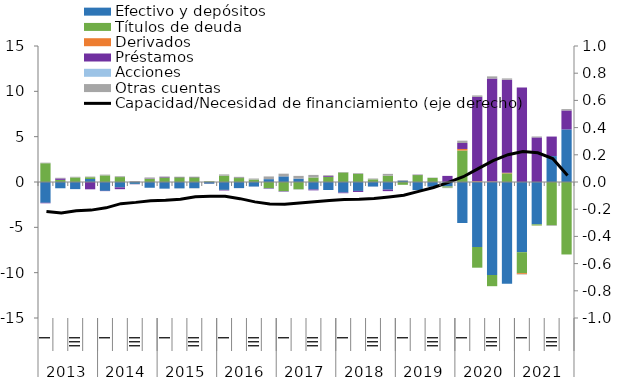
| Category | Efectivo y depósitos | Títulos de deuda | Derivados | Préstamos  | Acciones  | Otras cuentas |
|---|---|---|---|---|---|---|
| 0 | -2.293 | 2.069 | 0 | -0.055 | -0.001 | 0.063 |
| 1 | -0.692 | 0.233 | 0 | 0.161 | 0 | 0.069 |
| 2 | -0.786 | 0.501 | 0 | 0 | -0.001 | 0.075 |
| 3 | 0.331 | 0.197 | 0 | -0.806 | -0.001 | 0.072 |
| 4 | -0.977 | 0.727 | 0 | -0.028 | 0 | 0.088 |
| 5 | -0.594 | 0.545 | 0 | -0.199 | 0 | 0.09 |
| 6 | -0.211 | -0.016 | 0 | -0.024 | -0.001 | 0.102 |
| 7 | -0.636 | 0.349 | 0 | 0.048 | -0.004 | 0.104 |
| 8 | -0.735 | 0.5 | 0 | 0.069 | -0.006 | 0.036 |
| 9 | -0.704 | 0.518 | -0.004 | 0.029 | -0.004 | 0.037 |
| 10 | -0.689 | 0.516 | -0.006 | 0.03 | -0.003 | 0.043 |
| 11 | -0.191 | 0.076 | -0.005 | -0.009 | 0 | 0.026 |
| 12 | -0.871 | 0.694 | -0.008 | -0.055 | -0.008 | 0.142 |
| 13 | -0.666 | 0.438 | -0.003 | -0.005 | -0.016 | 0.131 |
| 14 | -0.503 | 0.268 | 0.002 | -0.009 | -0.017 | 0.112 |
| 15 | 0.316 | -0.702 | 0.002 | -0.05 | -0.024 | 0.296 |
| 16 | 0.622 | -1.017 | 0.007 | -0.05 | -0.015 | 0.288 |
| 17 | 0.375 | -0.811 | 0.005 | -0.008 | -0.008 | 0.293 |
| 18 | -0.829 | 0.496 | 0.002 | -0.091 | -0.006 | 0.283 |
| 19 | -0.884 | 0.575 | 0.001 | 0.09 | 0 | 0.083 |
| 20 | -1.167 | 1.054 | 0 | -0.067 | 0 | 0.052 |
| 21 | -0.985 | 0.886 | 0 | -0.111 | 0 | 0.083 |
| 22 | -0.503 | 0.295 | 0 | -0.004 | 0 | 0.091 |
| 23 | -0.843 | 0.691 | 0.001 | -0.164 | 0 | 0.205 |
| 24 | 0.148 | -0.309 | 0 | 0.002 | 0 | 0.063 |
| 25 | -0.898 | 0.764 | 0 | 0.033 | 0 | 0.033 |
| 26 | -0.521 | 0.45 | 0 | -0.006 | 0 | 0.036 |
| 27 | -0.489 | -0.135 | 0 | 0.673 | 0 | -0.053 |
| 28 | -4.521 | 3.471 | 0.173 | 0.657 | 0 | 0.259 |
| 29 | -7.172 | -2.279 | 0.073 | 9.32 | 0 | 0.156 |
| 30 | -10.26 | -1.232 | 0.058 | 11.353 | 0 | 0.239 |
| 31 | -11.223 | 0.96 | 0.06 | 10.262 | 0 | 0.141 |
| 32 | -7.744 | -2.312 | -0.108 | 10.429 | 0 | -0.043 |
| 33 | -4.67 | -0.126 | -0.01 | 4.919 | 0 | 0.103 |
| 34 | 2.86 | -4.772 | 0.003 | 2.149 | 0 | -0.068 |
| 35 | 5.805 | -7.993 | 0 | 2.087 | 0 | 0.149 |